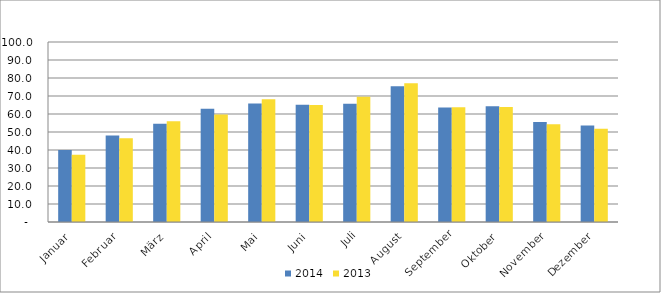
| Category | 2014 | 2013 |
|---|---|---|
| Januar | 39.932 | 37.314 |
| Februar | 48.076 | 46.493 |
| März | 54.552 | 56.037 |
| April | 62.934 | 59.712 |
| Mai | 65.83 | 68.179 |
| Juni | 65.093 | 64.95 |
| Juli | 65.749 | 69.615 |
| August | 75.423 | 77.108 |
| September | 63.618 | 63.808 |
| Oktober | 64.281 | 63.897 |
| November | 55.494 | 54.251 |
| Dezember | 53.605 | 51.835 |